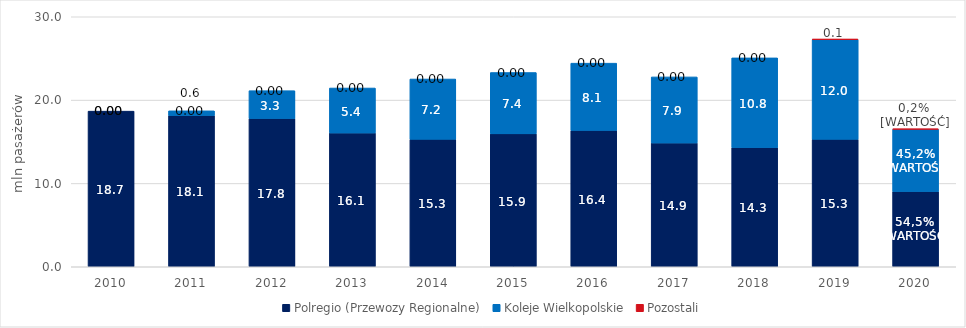
| Category | Polregio (Przewozy Regionalne) | Koleje Wielkopolskie | Pozostali |
|---|---|---|---|
| 2010 | 18.676 | 0 | 0 |
| 2011 | 18.147 | 0.566 | 0 |
| 2012 | 17.786 | 3.348 | 0 |
| 2013 | 16.054 | 5.398 | 0 |
| 2014 | 15.292 | 7.241 | 0 |
| 2015 | 15.945 | 7.366 | 0 |
| 2016 | 16.365 | 8.07 | 0 |
| 2017 | 14.855 | 7.927 | 0 |
| 2018 | 14.297 | 10.769 | 0 |
| 2019 | 15.29 | 11.971 | 0.057 |
| 2020 | 9.022 | 7.475 | 0.042 |